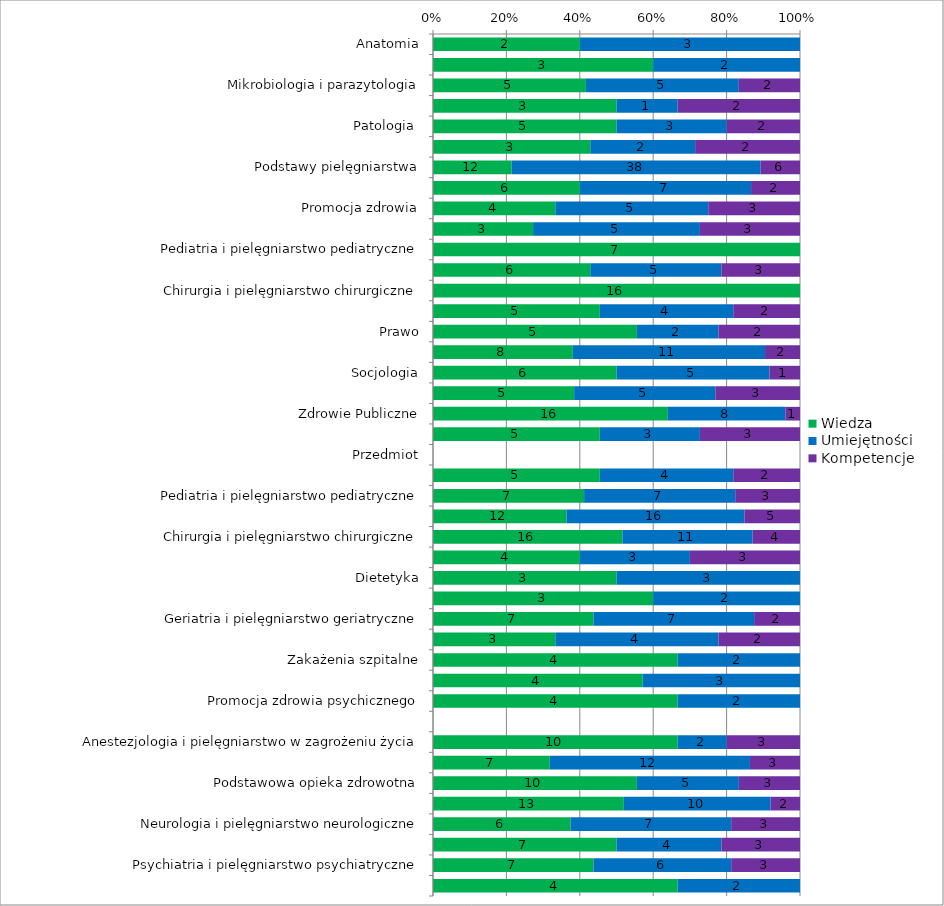
| Category | Wiedza | Umiejętności | Kompetencje |
|---|---|---|---|
| Anatomia | 2 | 3 | 0 |
| Biochemia i biofizyka | 3 | 2 | 0 |
| Mikrobiologia i parazytologia | 5 | 5 | 2 |
| Fizjologia | 3 | 1 | 2 |
| Patologia  | 5 | 3 | 2 |
| Genetyka | 3 | 2 | 2 |
| Podstawy pielęgniarstwa | 12 | 38 | 6 |
| Badania naukowe w pielęgniarstwie | 6 | 7 | 2 |
| Promocja zdrowia | 4 | 5 | 3 |
| Badanie fizykalne | 3 | 5 | 3 |
| Pediatria i pielęgniarstwo pediatryczne | 7 | 0 | 0 |
| Podstawy ratownictwa medycznego | 6 | 5 | 3 |
| Chirurgia i pielęgniarstwo chirurgiczne | 16 | 0 | 0 |
| Język angielski | 5 | 4 | 2 |
| Prawo | 5 | 2 | 2 |
| Psychologia | 8 | 11 | 2 |
| Socjologia | 6 | 5 | 1 |
| Pedagogika | 5 | 5 | 3 |
| Zdrowie Publiczne | 16 | 8 | 1 |
| Filozofia i etyka zawodu pielęgniarki | 5 | 3 | 3 |
| Przedmiot | 0 | 0 | 0 |
| Język angielski | 5 | 4 | 2 |
| Pediatria i pielęgniarstwo pediatryczne | 7 | 7 | 3 |
| Interna i pielęgniarstwo internistyczne | 12 | 16 | 5 |
| Chirurgia i pielęgniarstwo chirurgiczne | 16 | 11 | 4 |
| Rehabilitacja i pielęgnowanie niepełnosprawnych | 4 | 3 | 3 |
| Dietetyka | 3 | 3 | 0 |
| Radiologia | 3 | 2 | 0 |
| Geriatria i pielęgniarstwo geriatryczne | 7 | 7 | 2 |
| Farmakologia | 3 | 4 | 2 |
| Zakażenia szpitalne | 4 | 2 | 0 |
| Język migowy | 4 | 3 | 0 |
| Promocja zdrowia psychicznego | 4 | 2 | 0 |
| Przedmiot | 0 | 0 | 0 |
| Anestezjologia i pielęgniarstwo w zagrożeniu życia | 10 | 2 | 3 |
| Położnictwo, ginekologia i pielęgniarstwo połozniczo-ginekologiczne | 7 | 12 | 3 |
| Podstawowa opieka zdrowotna | 10 | 5 | 3 |
| Geriatria i pielęgniarstwo geriatryczne | 13 | 10 | 2 |
| Neurologia i pielęgniarstwo neurologiczne | 6 | 7 | 3 |
| Opieka paliatywna | 7 | 4 | 3 |
| Psychiatria i pielęgniarstwo psychiatryczne | 7 | 6 | 3 |
| Badania w pielęgniarstwie: seminaria dyplomowe (licencjackie)/przygotowanie do egzaminu dyplomowego (cz. Praktyczna) | 4 | 2 | 0 |